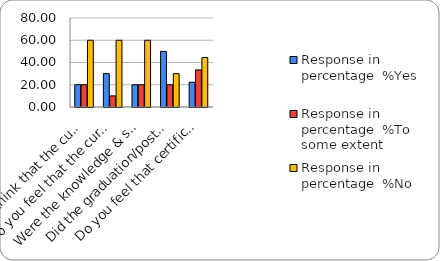
| Category | Response in percentage  |
|---|---|
| Do you think that the curriculum which you had during your graduation/post graduation has provided you with the knowledge & skills necessary to get employed/Self-employed or start own business? | 60 |
| Do you feel that the curriculum you studied is helpful in progression to higher studies? | 60 |
| Were the knowledge & skills acquired through the curriculum useful to you while working on the job?   | 60 |
| Did the graduation/post-graduation programme bring about any attitudinal and behavioural change in you? | 30 |
| Do you feel that certificate/ diploma courses offered by the college in addition to the curriculum lead to better career prospects? | 44.444 |